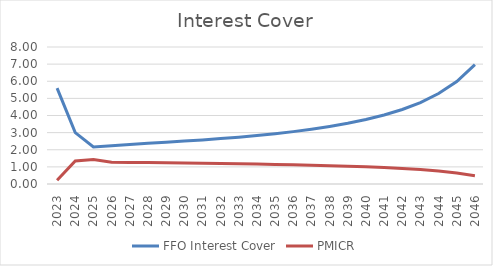
| Category | FFO Interest Cover | PMICR |
|---|---|---|
| 2023.0 | 5.601 | 0.217 |
| 2024.0 | 3.003 | 1.348 |
| 2025.0 | 2.158 | 1.429 |
| 2026.0 | 2.235 | 1.275 |
| 2027.0 | 2.304 | 1.262 |
| 2028.0 | 2.378 | 1.249 |
| 2029.0 | 2.442 | 1.236 |
| 2030.0 | 2.506 | 1.223 |
| 2031.0 | 2.576 | 1.208 |
| 2032.0 | 2.652 | 1.194 |
| 2033.0 | 2.736 | 1.178 |
| 2034.0 | 2.83 | 1.162 |
| 2035.0 | 2.936 | 1.143 |
| 2036.0 | 3.058 | 1.122 |
| 2037.0 | 3.199 | 1.097 |
| 2038.0 | 3.359 | 1.07 |
| 2039.0 | 3.543 | 1.04 |
| 2040.0 | 3.762 | 1.004 |
| 2041.0 | 4.03 | 0.959 |
| 2042.0 | 4.351 | 0.907 |
| 2043.0 | 4.756 | 0.842 |
| 2044.0 | 5.282 | 0.757 |
| 2045.0 | 5.984 | 0.643 |
| 2046.0 | 6.975 | 0.484 |